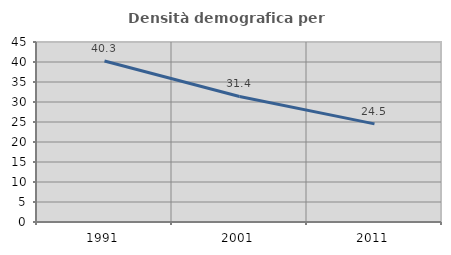
| Category | Densità demografica |
|---|---|
| 1991.0 | 40.258 |
| 2001.0 | 31.39 |
| 2011.0 | 24.535 |